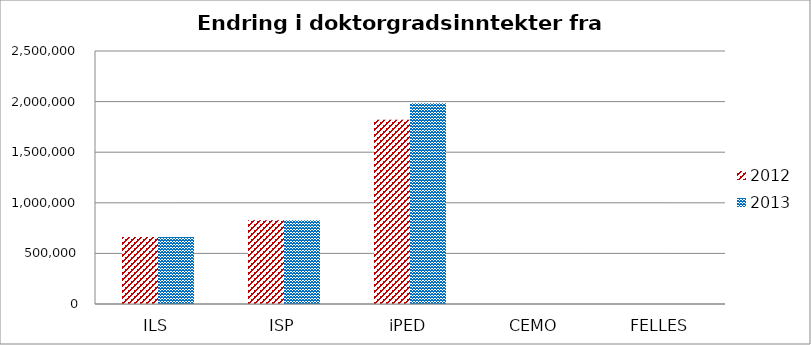
| Category | 2012 | 2013 |
|---|---|---|
| ILS | 662005 | 661333.333 |
| ISP | 827507 | 826666.667 |
| iPED | 1820515 | 1984000 |
| CEMO | 0 | 0 |
| FELLES | 0 | 0 |